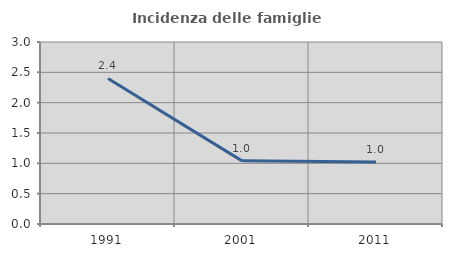
| Category | Incidenza delle famiglie numerose |
|---|---|
| 1991.0 | 2.399 |
| 2001.0 | 1.041 |
| 2011.0 | 1.022 |